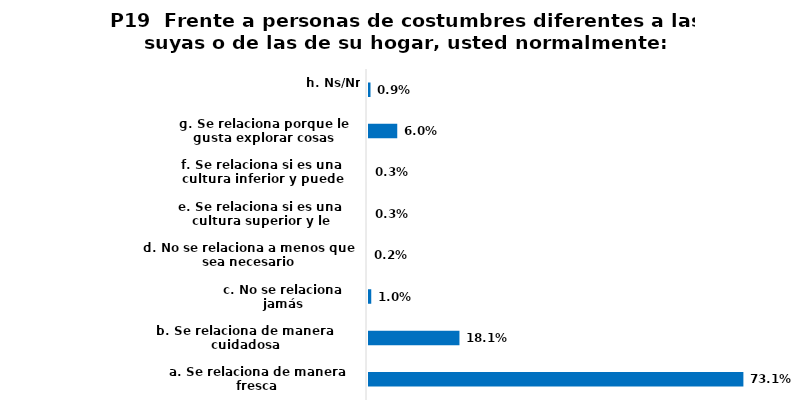
| Category | Series 0 |
|---|---|
| a. Se relaciona de manera fresca | 0.731 |
| b. Se relaciona de manera cuidadosa | 0.181 |
| c. No se relaciona jamás | 0.01 |
| d. No se relaciona a menos que sea necesario | 0.002 |
| e. Se relaciona si es una cultura superior y le conviene | 0.003 |
| f. Se relaciona si es una cultura inferior y puede ayudarle | 0.003 |
| g. Se relaciona porque le gusta explorar cosas desconocidas | 0.06 |
| h. Ns/Nr | 0.009 |